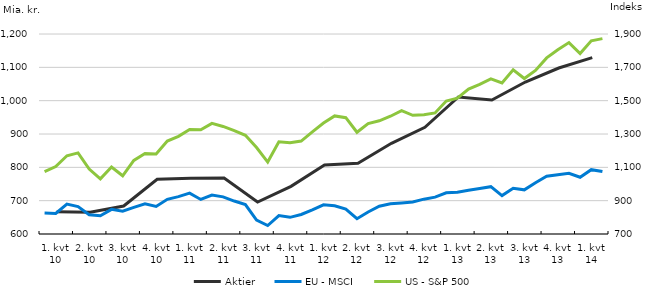
| Category | Aktier |
|---|---|
| 1. kvt 10 | 667 |
| 2. kvt 10 | 665 |
| 3. kvt 10 | 684 |
| 4. kvt 10 | 764 |
| 1. kvt 11 | 767 |
| 2. kvt 11 | 768 |
| 3. kvt 11 | 696 |
| 4. kvt 11 | 743 |
| 1. kvt 12 | 807 |
| 2. kvt 12 | 812 |
| 3. kvt 12 | 872 |
| 4. kvt 12 | 920 |
| 1. kvt 13 | 1011 |
| 2. kvt 13 | 1002 |
| 3. kvt 13 | 1056 |
| 4. kvt 13 | 1098 |
| 1. kvt 14 | 1129 |